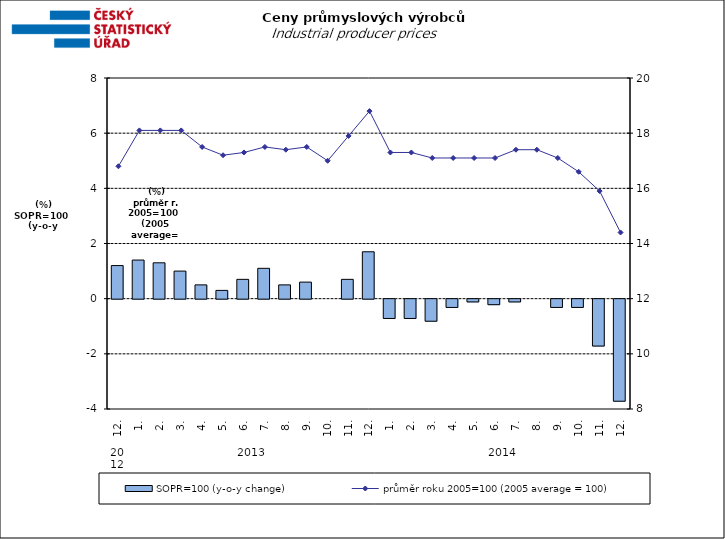
| Category | SOPR=100 (y-o-y change)   |
|---|---|
| 0 | 1.2 |
| 1 | 1.4 |
| 2 | 1.3 |
| 3 | 1 |
| 4 | 0.5 |
| 5 | 0.3 |
| 6 | 0.7 |
| 7 | 1.1 |
| 8 | 0.5 |
| 9 | 0.6 |
| 10 | 0 |
| 11 | 0.7 |
| 12 | 1.7 |
| 13 | -0.7 |
| 14 | -0.7 |
| 15 | -0.8 |
| 16 | -0.3 |
| 17 | -0.1 |
| 18 | -0.2 |
| 19 | -0.1 |
| 20 | 0 |
| 21 | -0.3 |
| 22 | -0.3 |
| 23 | -1.7 |
| 24 | -3.7 |